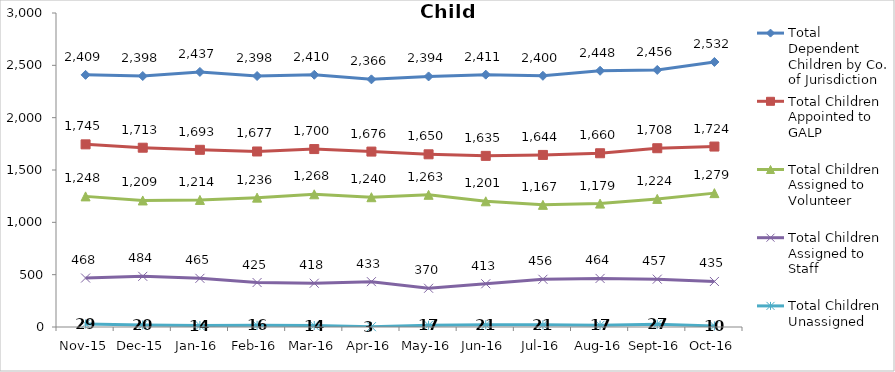
| Category | Total Dependent Children by Co. of Jurisdiction | Total Children Appointed to GALP | Total Children Assigned to Volunteer | Total Children Assigned to Staff | Total Children Unassigned |
|---|---|---|---|---|---|
| Nov-15 | 2409 | 1745 | 1248 | 468 | 29 |
| Dec-15 | 2398 | 1713 | 1209 | 484 | 20 |
| Jan-16 | 2437 | 1693 | 1214 | 465 | 14 |
| Feb-16 | 2398 | 1677 | 1236 | 425 | 16 |
| Mar-16 | 2410 | 1700 | 1268 | 418 | 14 |
| Apr-16 | 2366 | 1676 | 1240 | 433 | 3 |
| May-16 | 2394 | 1650 | 1263 | 370 | 17 |
| Jun-16 | 2411 | 1635 | 1201 | 413 | 21 |
| Jul-16 | 2400 | 1644 | 1167 | 456 | 21 |
| Aug-16 | 2448 | 1660 | 1179 | 464 | 17 |
| Sep-16 | 2456 | 1708 | 1224 | 457 | 27 |
| Oct-16 | 2532 | 1724 | 1279 | 435 | 10 |